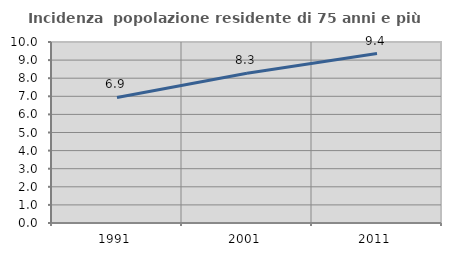
| Category | Incidenza  popolazione residente di 75 anni e più |
|---|---|
| 1991.0 | 6.938 |
| 2001.0 | 8.276 |
| 2011.0 | 9.359 |